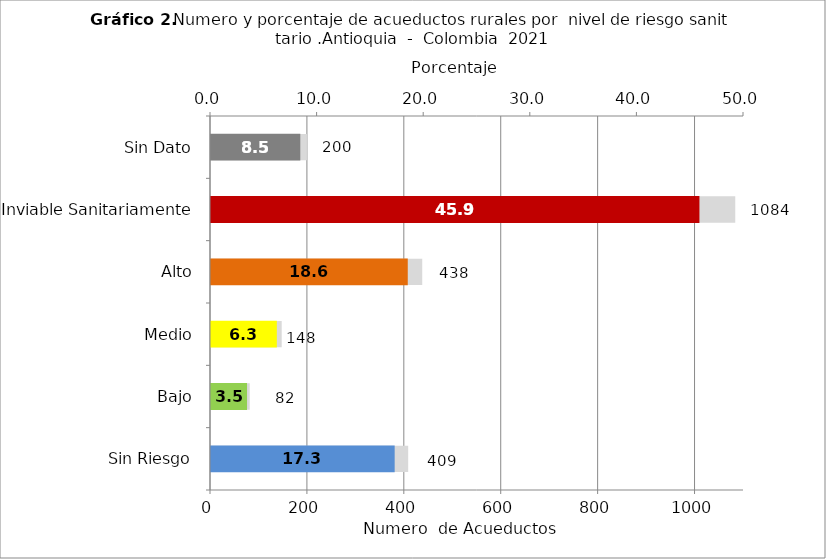
| Category | Número de Sistemas |
|---|---|
| Sin Riesgo | 409 |
| Bajo | 82 |
| Medio | 148 |
| Alto | 438 |
| Inviable Sanitariamente | 1084 |
| Sin Dato | 200 |